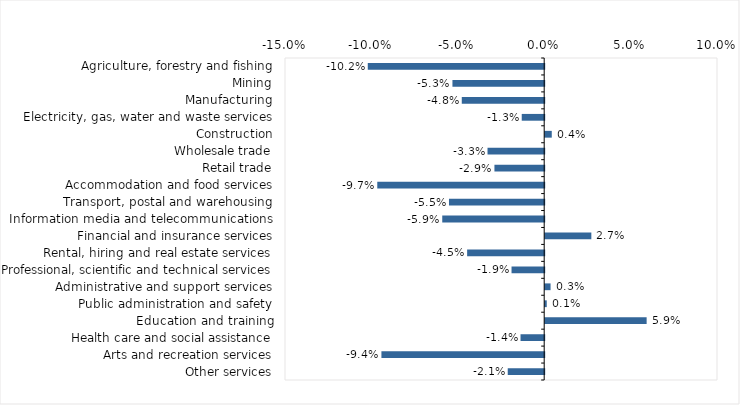
| Category | This week |
|---|---|
| Agriculture, forestry and fishing | -0.102 |
| Mining | -0.053 |
| Manufacturing | -0.048 |
| Electricity, gas, water and waste services | -0.013 |
| Construction | 0.004 |
| Wholesale trade | -0.033 |
| Retail trade | -0.029 |
| Accommodation and food services | -0.097 |
| Transport, postal and warehousing | -0.055 |
| Information media and telecommunications | -0.059 |
| Financial and insurance services | 0.027 |
| Rental, hiring and real estate services | -0.045 |
| Professional, scientific and technical services | -0.019 |
| Administrative and support services | 0.003 |
| Public administration and safety | 0.001 |
| Education and training | 0.059 |
| Health care and social assistance | -0.014 |
| Arts and recreation services | -0.094 |
| Other services | -0.021 |